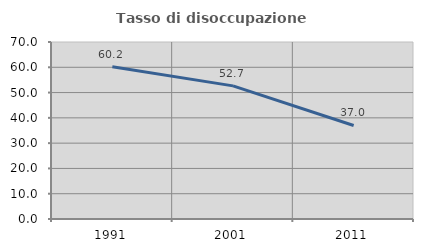
| Category | Tasso di disoccupazione giovanile  |
|---|---|
| 1991.0 | 60.235 |
| 2001.0 | 52.655 |
| 2011.0 | 36.994 |